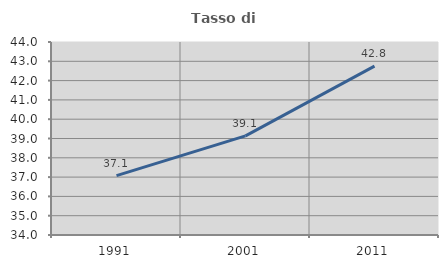
| Category | Tasso di occupazione   |
|---|---|
| 1991.0 | 37.076 |
| 2001.0 | 39.138 |
| 2011.0 | 42.752 |